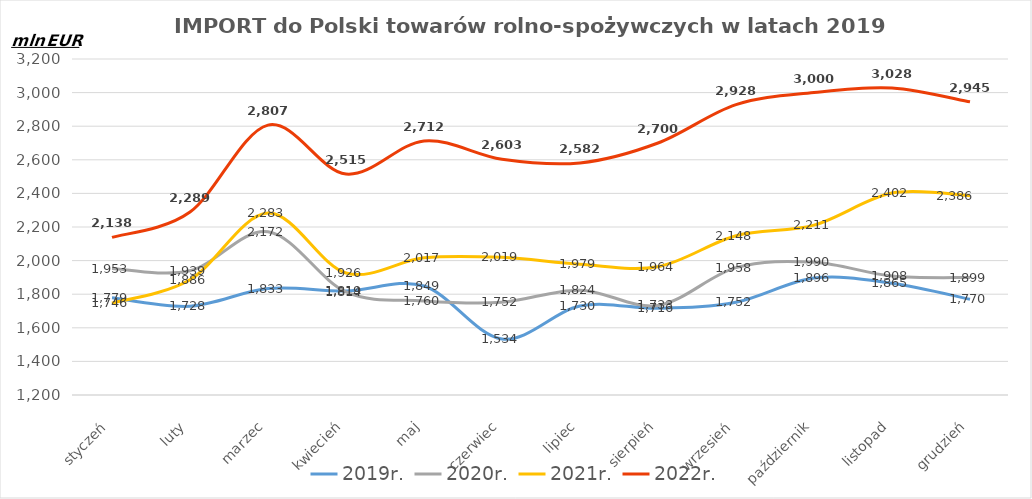
| Category | 2019r. | 2020r. | 2021r. | 2022r. |
|---|---|---|---|---|
| styczeń | 1778.516 | 1952.875 | 1746.472 | 2137.808 |
| luty | 1728.388 | 1939.238 | 1886.399 | 2289.091 |
| marzec | 1833.298 | 2171.859 | 2282.675 | 2806.642 |
| kwiecień | 1818.941 | 1813.505 | 1926.266 | 2514.891 |
| maj | 1848.523 | 1760.244 | 2016.59 | 2712.423 |
| czerwiec | 1533.822 | 1752.308 | 2019.216 | 2603.364 |
| lipiec | 1729.609 | 1824.019 | 1978.508 | 2581.646 |
| sierpień | 1716.034 | 1733.376 | 1963.864 | 2700.066 |
| wrzesień | 1751.943 | 1958.051 | 2148.063 | 2928.412 |
| październik | 1896.06 | 1990.136 | 2211.192 | 3000.315 |
| listopad | 1865.468 | 1908.281 | 2402.132 | 3027.608 |
| grudzień | 1769.878 | 1898.918 | 2385.812 | 2945.108 |